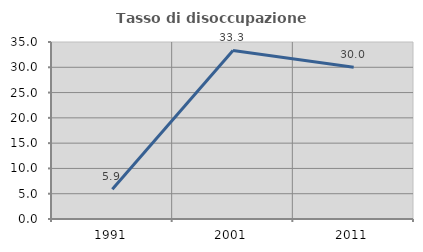
| Category | Tasso di disoccupazione giovanile  |
|---|---|
| 1991.0 | 5.882 |
| 2001.0 | 33.333 |
| 2011.0 | 30 |